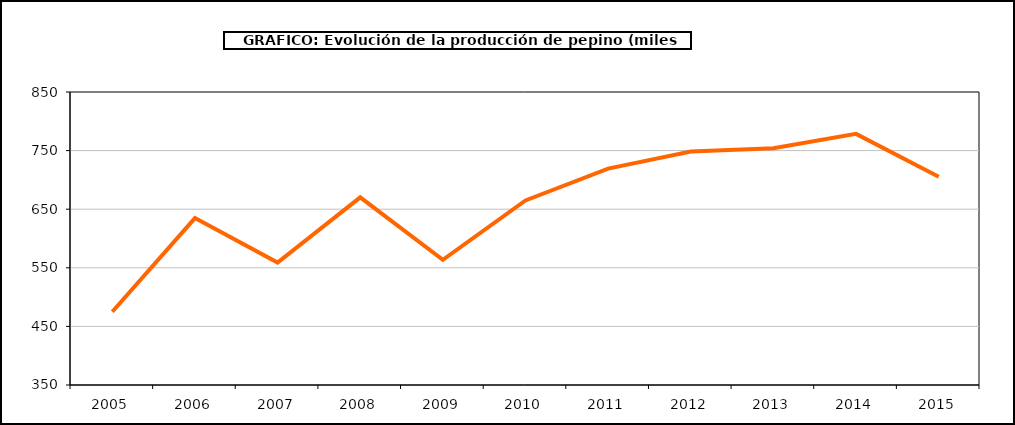
| Category | producción |
|---|---|
| 2005.0 | 474.948 |
| 2006.0 | 634.864 |
| 2007.0 | 558.817 |
| 2008.0 | 670.162 |
| 2009.0 | 563.566 |
| 2010.0 | 664.975 |
| 2011.0 | 719.219 |
| 2012.0 | 748.5 |
| 2013.0 | 753.941 |
| 2014.0 | 778.571 |
| 2015.0 | 705.223 |